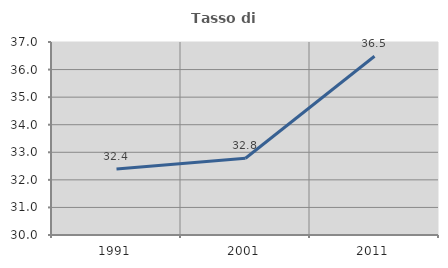
| Category | Tasso di occupazione   |
|---|---|
| 1991.0 | 32.39 |
| 2001.0 | 32.784 |
| 2011.0 | 36.483 |